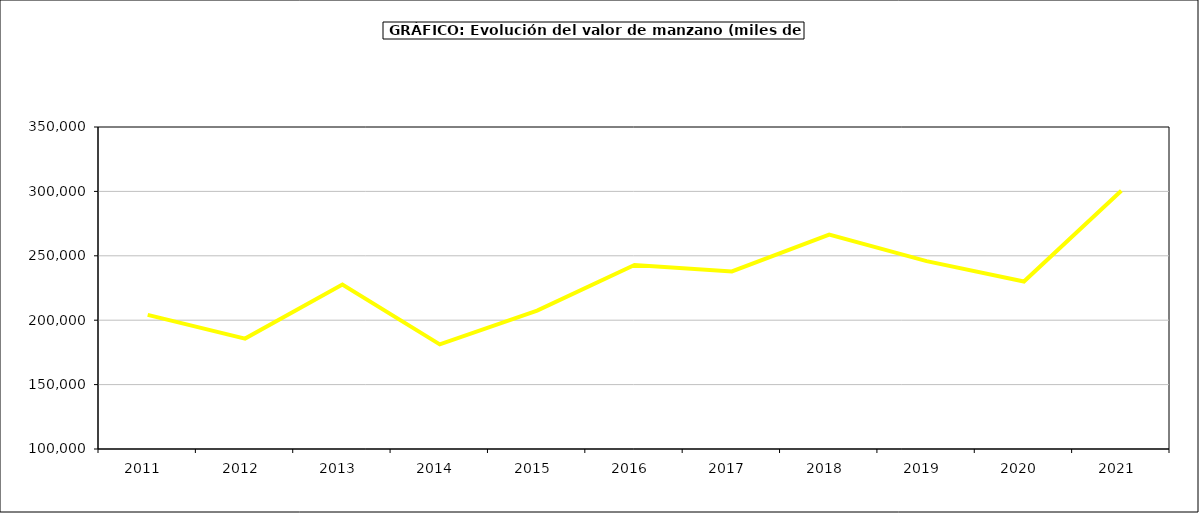
| Category | valor manzano |
|---|---|
| 2011.0 | 204168.506 |
| 2012.0 | 185703.956 |
| 2013.0 | 227733.263 |
| 2014.0 | 181209.741 |
| 2015.0 | 207515 |
| 2016.0 | 242923 |
| 2017.0 | 237842.719 |
| 2018.0 | 266393.145 |
| 2019.0 | 245889.131 |
| 2020.0 | 230039.865 |
| 2021.0 | 300463.556 |